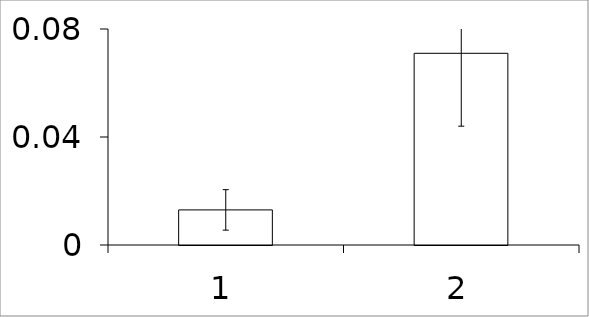
| Category | Series 0 |
|---|---|
| 0 | 0.013 |
| 1 | 0.071 |